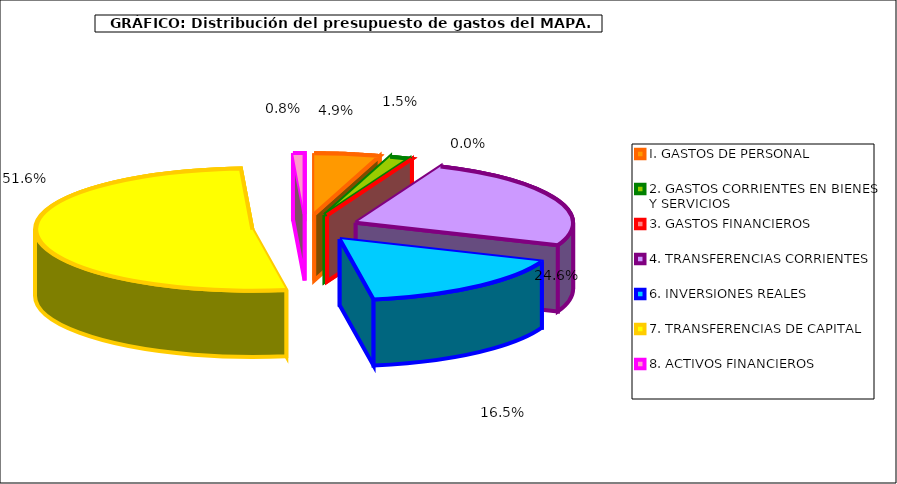
| Category | I. GASTOS DE PERSONAL |
|---|---|
| I. GASTOS DE PERSONAL | 69575790 |
| 2. GASTOS CORRIENTES EN BIENES Y SERVICIOS | 21621920 |
| 3. GASTOS FINANCIEROS | 39350 |
| 4. TRANSFERENCIAS CORRIENTES | 352063560 |
| 6. INVERSIONES REALES | 236039810 |
| 7. TRANSFERENCIAS DE CAPITAL | 738437680 |
| 8. ACTIVOS FINANCIEROS | 12137520 |